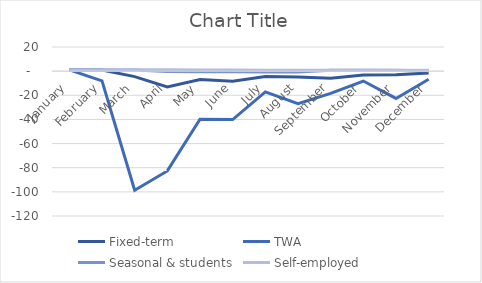
| Category |  Fixed-term  |  TWA  |  Seasonal & students  |  Self-employed  |
|---|---|---|---|---|
| January | 1 | 1 | 1 | 1 |
| February | 0.945 | -8.107 | 0.931 | 1.016 |
| March | -4.549 | -98.683 | 0.928 | 1.144 |
| April | -13.123 | -82.656 | -0.322 | 1.125 |
| May | -6.964 | -39.862 | -0.429 | 0.901 |
| June | -8.277 | -40.091 | -0.526 | 0.888 |
| July | -4.448 | -17.243 | -0.628 | 0.835 |
| August | -4.82 | -26.91 | -0.779 | 0.796 |
| September | -5.965 | -18.467 | 0.665 | 0.814 |
| October | -3.287 | -8.189 | 0.776 | 0.671 |
| November | -2.997 | -22.61 | 0.695 | 0.617 |
| December | -1.496 | -6.648 | 0.279 | 0.638 |